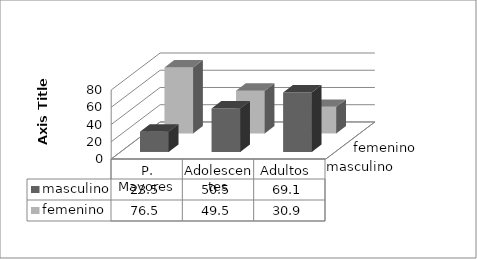
| Category | masculino | femenino |
|---|---|---|
| P. Mayores | 23.5 | 76.5 |
| Adolescentes | 50.5 | 49.5 |
| Adultos  | 69.1 | 30.9 |